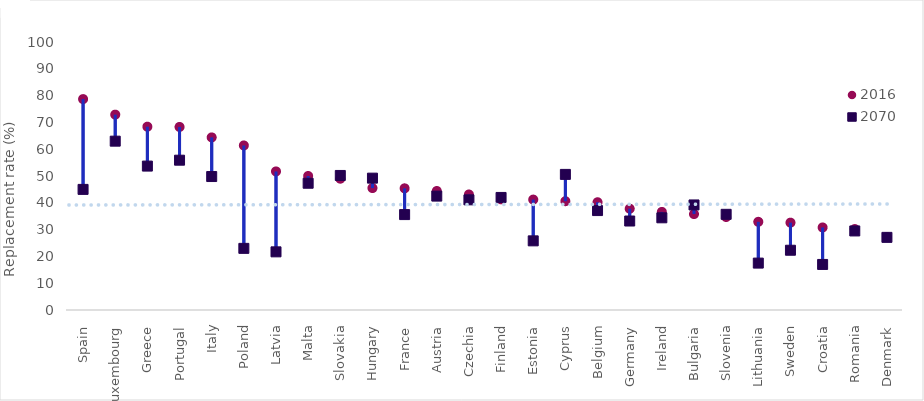
| Category | 2016 | 2070 |
|---|---|---|
| Spain | 78.7 | 45 |
| Luxembourg | 72.9 | 63 |
| Greece | 68.4 | 53.7 |
| Portugal | 68.3 | 55.9 |
| Italy | 64.4 | 49.8 |
| Poland | 61.4 | 23 |
| Latvia | 51.7 | 21.7 |
| Malta | 50 | 47.3 |
| Slovakia | 49 | 50.2 |
| Hungary | 45.5 | 49.2 |
| France | 45.4 | 35.6 |
| Austria | 44.4 | 42.5 |
| Czechia | 43.1 | 41.1 |
| Finland | 41.3 | 42 |
| Estonia | 41.2 | 25.8 |
| Cyprus | 40.6 | 50.6 |
| Belgium | 40.2 | 37.1 |
| Germany | 37.8 | 33.2 |
| Ireland | 36.6 | 34.4 |
| Bulgaria | 35.8 | 39.2 |
| Slovenia | 34.7 | 35.7 |
| Lithuania | 32.9 | 17.5 |
| Sweden | 32.6 | 22.3 |
| Croatia | 30.8 | 17 |
| Romania | 30.2 | 29.5 |
| Denmark | 27.2 | 27.1 |